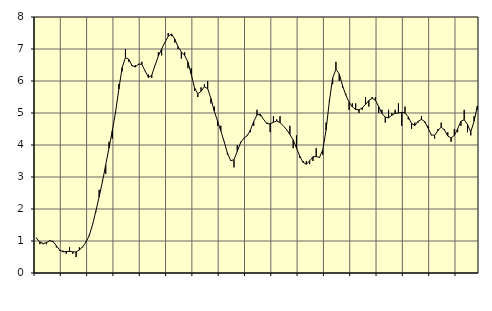
| Category | Piggar | Series 1 |
|---|---|---|
| nan | 1.1 | 1.07 |
| 87.0 | 0.9 | 0.97 |
| 87.0 | 0.9 | 0.92 |
| 87.0 | 0.9 | 0.95 |
| nan | 1 | 1.01 |
| 88.0 | 1 | 0.98 |
| 88.0 | 0.8 | 0.85 |
| 88.0 | 0.7 | 0.72 |
| nan | 0.7 | 0.66 |
| 89.0 | 0.6 | 0.67 |
| 89.0 | 0.8 | 0.68 |
| 89.0 | 0.6 | 0.66 |
| nan | 0.5 | 0.66 |
| 90.0 | 0.8 | 0.72 |
| 90.0 | 0.8 | 0.82 |
| 90.0 | 1 | 0.96 |
| nan | 1.2 | 1.17 |
| 91.0 | 1.5 | 1.51 |
| 91.0 | 1.9 | 1.93 |
| 91.0 | 2.6 | 2.38 |
| nan | 2.9 | 2.85 |
| 92.0 | 3.1 | 3.38 |
| 92.0 | 4.1 | 3.91 |
| 92.0 | 4.2 | 4.44 |
| nan | 5 | 5.03 |
| 93.0 | 5.9 | 5.75 |
| 93.0 | 6.3 | 6.42 |
| 93.0 | 7 | 6.73 |
| nan | 6.6 | 6.68 |
| 94.0 | 6.5 | 6.48 |
| 94.0 | 6.5 | 6.44 |
| 94.0 | 6.5 | 6.53 |
| nan | 6.6 | 6.52 |
| 95.0 | 6.3 | 6.31 |
| 95.0 | 6.2 | 6.11 |
| 95.0 | 6.1 | 6.18 |
| nan | 6.5 | 6.49 |
| 96.0 | 6.9 | 6.78 |
| 96.0 | 6.8 | 7 |
| 96.0 | 7.2 | 7.21 |
| nan | 7.5 | 7.4 |
| 97.0 | 7.4 | 7.47 |
| 97.0 | 7.2 | 7.31 |
| 97.0 | 7 | 7.07 |
| nan | 6.7 | 6.91 |
| 98.0 | 6.9 | 6.8 |
| 98.0 | 6.4 | 6.59 |
| 98.0 | 6.4 | 6.21 |
| nan | 5.7 | 5.79 |
| 99.0 | 5.5 | 5.6 |
| 99.0 | 5.8 | 5.68 |
| 99.0 | 5.9 | 5.82 |
| nan | 6 | 5.76 |
| 0.0 | 5.3 | 5.45 |
| 0.0 | 5.2 | 5.06 |
| 0.0 | 4.6 | 4.75 |
| nan | 4.6 | 4.44 |
| 1.0 | 4.1 | 4.11 |
| 1.0 | 3.7 | 3.75 |
| 1.0 | 3.5 | 3.51 |
| nan | 3.3 | 3.54 |
| 2.0 | 4 | 3.8 |
| 2.0 | 4.1 | 4.07 |
| 2.0 | 4.2 | 4.21 |
| nan | 4.3 | 4.29 |
| 3.0 | 4.4 | 4.47 |
| 3.0 | 4.6 | 4.73 |
| 3.0 | 5.1 | 4.94 |
| nan | 4.9 | 4.96 |
| 4.0 | 4.8 | 4.8 |
| 4.0 | 4.7 | 4.67 |
| 4.0 | 4.4 | 4.66 |
| nan | 4.9 | 4.71 |
| 5.0 | 4.8 | 4.75 |
| 5.0 | 4.9 | 4.7 |
| 5.0 | 4.6 | 4.6 |
| nan | 4.5 | 4.48 |
| 6.0 | 4.6 | 4.33 |
| 6.0 | 3.9 | 4.16 |
| 6.0 | 4.3 | 3.91 |
| nan | 3.6 | 3.65 |
| 7.0 | 3.5 | 3.46 |
| 7.0 | 3.5 | 3.4 |
| 7.0 | 3.4 | 3.5 |
| nan | 3.5 | 3.63 |
| 8.0 | 3.9 | 3.64 |
| 8.0 | 3.6 | 3.61 |
| 8.0 | 3.7 | 3.85 |
| nan | 4.7 | 4.47 |
| 9.0 | 5.4 | 5.36 |
| 9.0 | 5.9 | 6.09 |
| 9.0 | 6.6 | 6.37 |
| nan | 6 | 6.22 |
| 10.0 | 5.8 | 5.86 |
| 10.0 | 5.6 | 5.56 |
| 10.0 | 5.1 | 5.34 |
| nan | 5.3 | 5.19 |
| 11.0 | 5.3 | 5.11 |
| 11.0 | 5 | 5.1 |
| 11.0 | 5.1 | 5.16 |
| nan | 5.5 | 5.27 |
| 12.0 | 5.2 | 5.39 |
| 12.0 | 5.5 | 5.46 |
| 12.0 | 5.5 | 5.4 |
| nan | 5 | 5.2 |
| 13.0 | 5.1 | 4.98 |
| 13.0 | 4.7 | 4.87 |
| 13.0 | 5.1 | 4.85 |
| nan | 5 | 4.93 |
| 14.0 | 5.1 | 4.99 |
| 14.0 | 5.3 | 5 |
| 14.0 | 4.6 | 5.02 |
| nan | 5.2 | 5 |
| 15.0 | 4.8 | 4.88 |
| 15.0 | 4.5 | 4.67 |
| 15.0 | 4.7 | 4.61 |
| nan | 4.7 | 4.74 |
| 16.0 | 4.9 | 4.8 |
| 16.0 | 4.7 | 4.73 |
| 16.0 | 4.6 | 4.53 |
| nan | 4.3 | 4.32 |
| 17.0 | 4.2 | 4.3 |
| 17.0 | 4.5 | 4.45 |
| 17.0 | 4.7 | 4.56 |
| nan | 4.5 | 4.47 |
| 18.0 | 4.4 | 4.28 |
| 18.0 | 4.1 | 4.22 |
| 18.0 | 4.5 | 4.3 |
| nan | 4.4 | 4.5 |
| 19.0 | 4.6 | 4.74 |
| 19.0 | 5.1 | 4.79 |
| 19.0 | 4.4 | 4.64 |
| nan | 4.3 | 4.41 |
| 20.0 | 4.9 | 4.74 |
| 20.0 | 5.1 | 5.22 |